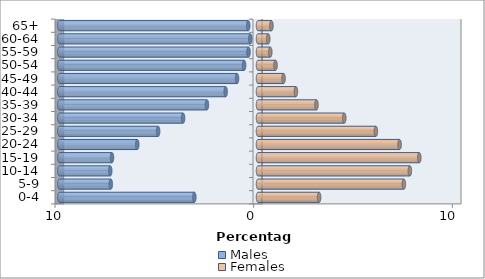
| Category | Males | Females |
|---|---|---|
| 0-4 | -3.205 | 3.077 |
| 5-9 | -7.409 | 7.342 |
| 10-14 | -7.438 | 7.644 |
| 15-19 | -7.35 | 8.119 |
| 20-24 | -6.078 | 7.127 |
| 25-29 | -5.028 | 5.934 |
| 30-34 | -3.771 | 4.342 |
| 35-39 | -2.571 | 2.944 |
| 40-44 | -1.626 | 1.909 |
| 45-49 | -1.054 | 1.286 |
| 50-54 | -0.699 | 0.882 |
| 55-59 | -0.477 | 0.617 |
| 60-64 | -0.387 | 0.515 |
| 65+ | -0.494 | 0.677 |